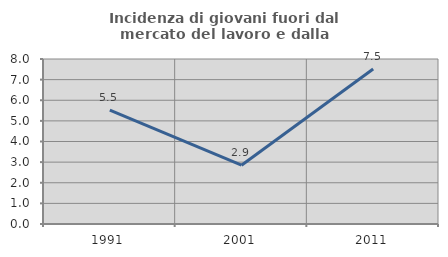
| Category | Incidenza di giovani fuori dal mercato del lavoro e dalla formazione  |
|---|---|
| 1991.0 | 5.517 |
| 2001.0 | 2.851 |
| 2011.0 | 7.513 |